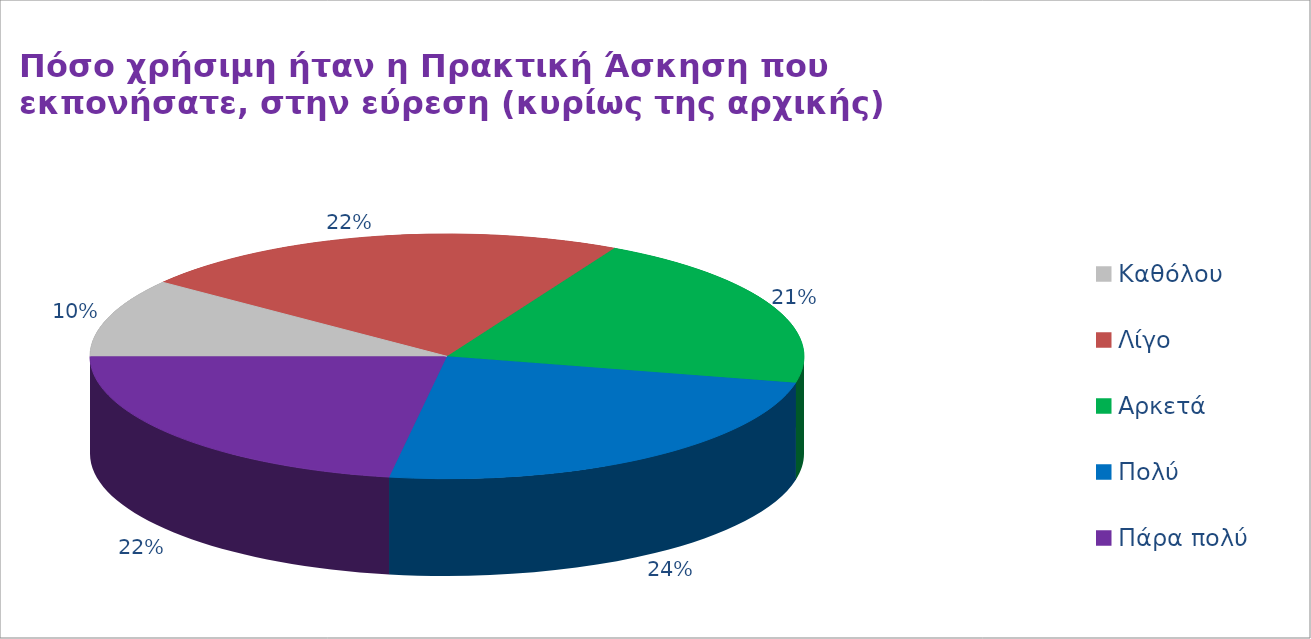
| Category | Series 1 | Series 0 |
|---|---|---|
| Καθόλου | 6 | 2 |
| Λίγο | 13 | 7 |
| Αρκετά | 12 | 30 |
| Πολύ | 14 | 9 |
| Πάρα πολύ | 13 | 10 |